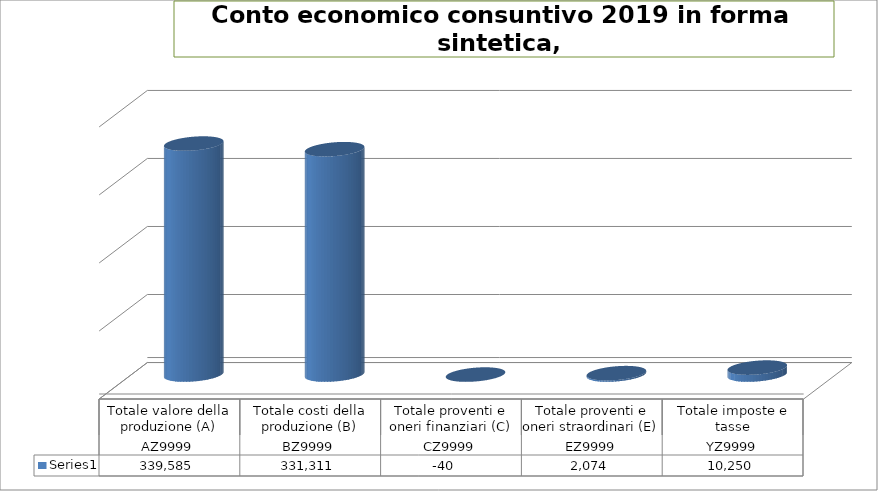
| Category | Series 0 |
|---|---|
| 0 | 339585 |
| 1 | 331311 |
| 2 | -40 |
| 3 | 2074 |
| 4 | 10250 |